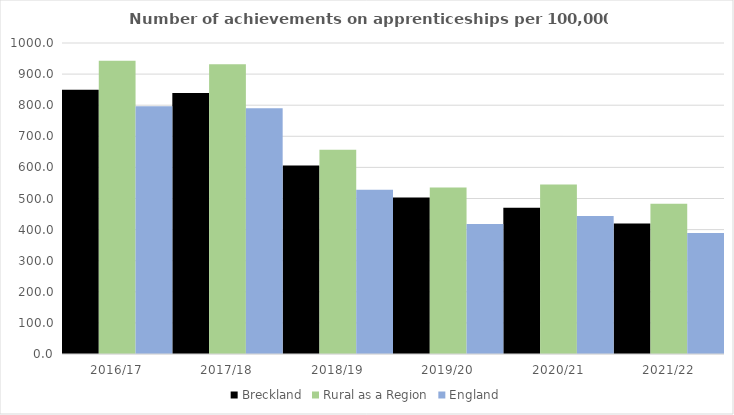
| Category | Breckland | Rural as a Region | England |
|---|---|---|---|
| 2016/17 | 850 | 942.594 | 797 |
| 2017/18 | 839 | 931.709 | 790 |
| 2018/19 | 606 | 656.44 | 528 |
| 2019/20 | 503 | 535.552 | 418 |
| 2020/21 | 470 | 545.333 | 444 |
| 2021/22 | 420 | 482.936 | 389 |